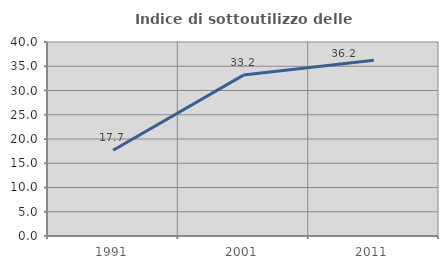
| Category | Indice di sottoutilizzo delle abitazioni  |
|---|---|
| 1991.0 | 17.674 |
| 2001.0 | 33.178 |
| 2011.0 | 36.225 |